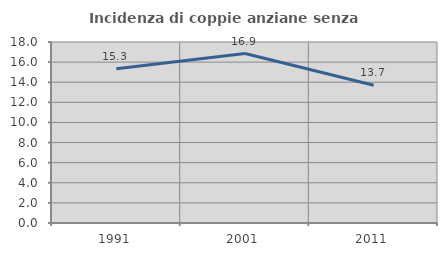
| Category | Incidenza di coppie anziane senza figli  |
|---|---|
| 1991.0 | 15.328 |
| 2001.0 | 16.856 |
| 2011.0 | 13.699 |